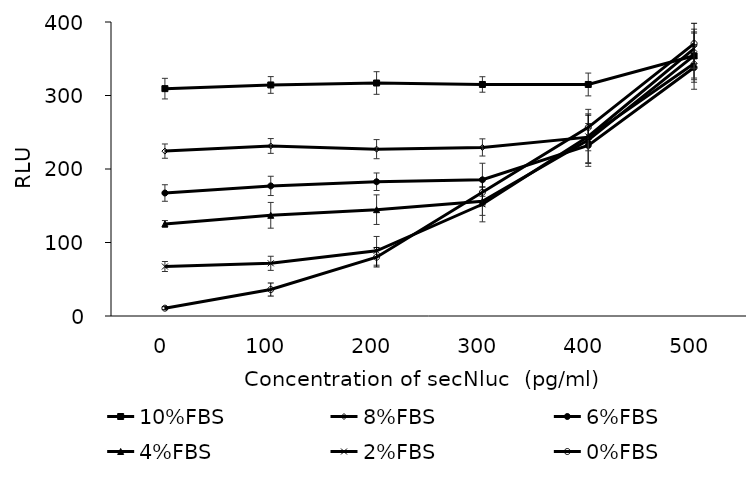
| Category | 10%FBS | 8%FBS | 6%FBS | 4%FBS | 2%FBS | 0%FBS |
|---|---|---|---|---|---|---|
| 0.0 | 309.333 | 224.333 | 167.333 | 125.333 | 67.333 | 10.667 |
| 100.0 | 314.333 | 231.333 | 177 | 137 | 71.667 | 36 |
| 200.0 | 317 | 227 | 182.667 | 144.667 | 88.667 | 80 |
| 300.0 | 315 | 229.333 | 185.333 | 156 | 152 | 168.333 |
| 400.0 | 315 | 243.333 | 232 | 239.333 | 244.333 | 256.667 |
| 500.0 | 354 | 343.667 | 338 | 354.333 | 363.667 | 370.667 |